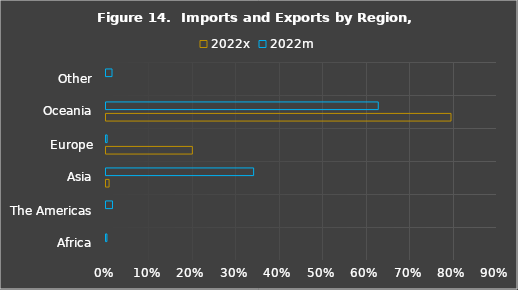
| Category | 2022x | 2022m |
|---|---|---|
| Africa | 0 | 0.002 |
| The Americas | 0 | 0.015 |
| Asia | 0.007 | 0.34 |
| Europe | 0.199 | 0.003 |
| Oceania | 0.794 | 0.627 |
| Other | 0 | 0.014 |